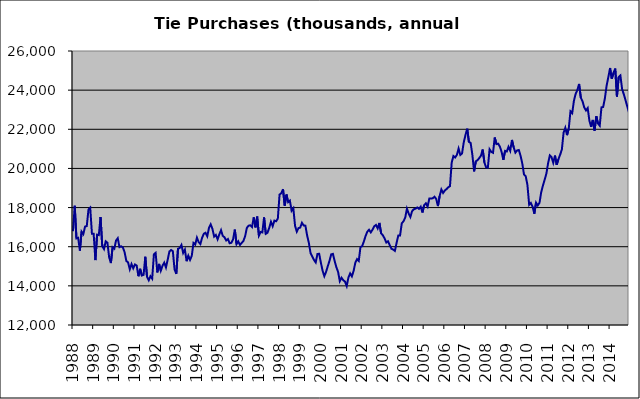
| Category | Series 0 |
|---|---|
| 1988.0 | 16794 |
| nan | 18096 |
| nan | 16425 |
| nan | 16454 |
| nan | 15802 |
| nan | 16769 |
| nan | 16644 |
| nan | 17028 |
| nan | 17057 |
| nan | 17905 |
| nan | 17995 |
| nan | 16665 |
| 1989.0 | 16665 |
| nan | 15316 |
| nan | 16619 |
| nan | 16593 |
| nan | 17519 |
| nan | 16026 |
| nan | 15879 |
| nan | 16277 |
| nan | 16203 |
| nan | 15461 |
| nan | 15163 |
| nan | 15972 |
| 1990.0 | 15899 |
| nan | 16314 |
| nan | 16434 |
| nan | 15977 |
| nan | 16020 |
| nan | 15960 |
| nan | 15711 |
| nan | 15271 |
| nan | 15199 |
| nan | 14844 |
| nan | 15113 |
| nan | 14898 |
| 1991.0 | 15092 |
| nan | 15037 |
| nan | 14492 |
| nan | 14871 |
| nan | 14530 |
| nan | 14562 |
| nan | 15485 |
| nan | 14460 |
| nan | 14286 |
| nan | 14494 |
| nan | 14368 |
| nan | 15613 |
| 1992.0 | 15687 |
| nan | 14688 |
| nan | 15120 |
| nan | 14773 |
| nan | 15028 |
| nan | 15185 |
| nan | 14940 |
| nan | 15334 |
| nan | 15756 |
| nan | 15832 |
| nan | 15770 |
| nan | 14841 |
| 1993.0 | 14611 |
| nan | 15894 |
| nan | 15935 |
| nan | 16089 |
| nan | 15681 |
| nan | 15852 |
| nan | 15260 |
| nan | 15539 |
| nan | 15326 |
| nan | 15535 |
| nan | 16195 |
| nan | 16113 |
| 1994.0 | 16461 |
| nan | 16234 |
| nan | 16139 |
| nan | 16458 |
| nan | 16663 |
| nan | 16714 |
| nan | 16533 |
| nan | 16965 |
| nan | 17141 |
| nan | 16912 |
| nan | 16518 |
| nan | 16600 |
| 1995.0 | 16377 |
| nan | 16627 |
| nan | 16845 |
| nan | 16555 |
| nan | 16483 |
| nan | 16320 |
| nan | 16392 |
| nan | 16177 |
| nan | 16200 |
| nan | 16378 |
| nan | 16874 |
| nan | 16131 |
| 1996.0 | 16274 |
| nan | 16091 |
| nan | 16194 |
| nan | 16295 |
| nan | 16540 |
| nan | 16965 |
| nan | 17074 |
| nan | 17096 |
| nan | 17004 |
| nan | 17502 |
| nan | 16988 |
| nan | 17539 |
| 1997.0 | 16566 |
| nan | 16751 |
| nan | 16730 |
| nan | 17496 |
| nan | 16659 |
| nan | 16714 |
| nan | 16966 |
| nan | 17275 |
| nan | 17050 |
| nan | 17334 |
| nan | 17299 |
| nan | 17439 |
| 1998.0 | 18664 |
| nan | 18734 |
| nan | 18936 |
| nan | 18098 |
| nan | 18667 |
| nan | 18275 |
| nan | 18355 |
| nan | 17838 |
| nan | 17966 |
| nan | 17066 |
| nan | 16772 |
| nan | 16950 |
| 1999.0 | 16977 |
| nan | 17223 |
| nan | 17085 |
| nan | 17076 |
| nan | 16579 |
| nan | 16203 |
| nan | 15678 |
| nan | 15500 |
| nan | 15324 |
| nan | 15196 |
| nan | 15627 |
| nan | 15640 |
| 2000.0 | 15186 |
| nan | 14772 |
| nan | 14494 |
| nan | 14711 |
| nan | 15001 |
| nan | 15277 |
| nan | 15608 |
| nan | 15633.6 |
| nan | 15268 |
| nan | 14952.4 |
| nan | 14714.4 |
| nan | 14235.1 |
| 2001.0 | 14412.1 |
| nan | 14288.1 |
| nan | 14220.1 |
| nan | 13991.1 |
| nan | 14425.1 |
| nan | 14636.1 |
| nan | 14486.1 |
| nan | 14755.5 |
| nan | 15180.1 |
| nan | 15366.7 |
| nan | 15270.7 |
| nan | 15981 |
| 2002.0 | 16029 |
| nan | 16278 |
| nan | 16554 |
| nan | 16772 |
| nan | 16864.779 |
| nan | 16732.143 |
| nan | 16869.773 |
| nan | 17044.272 |
| nan | 17110.816 |
| nan | 16935.357 |
| nan | 17214.632 |
| nan | 16685.945 |
| 2003.0 | 16584.762 |
| nan | 16423.965 |
| nan | 16213.153 |
| nan | 16279.62 |
| nan | 16079.803 |
| nan | 15893.929 |
| nan | 15856.449 |
| nan | 15786.375 |
| nan | 16206.63 |
| nan | 16576.807 |
| nan | 16577.258 |
| nan | 17193.927 |
| 2004.0 | 17300.698 |
| nan | 17486.896 |
| nan | 17943.35 |
| nan | 17698.616 |
| nan | 17520.808 |
| nan | 17820.038 |
| nan | 17913.671 |
| nan | 17943.361 |
| nan | 18006.259 |
| nan | 17933.267 |
| nan | 18045.705 |
| nan | 17749.231 |
| 2005.0 | 18120.293 |
| nan | 18217.964 |
| nan | 18050.513 |
| nan | 18460.353 |
| nan | 18462.346 |
| nan | 18474.613 |
| nan | 18553.183 |
| nan | 18441.251 |
| nan | 18076.596 |
| nan | 18589.667 |
| nan | 18925.778 |
| nan | 18744.891 |
| 2006.0 | 18872.122 |
| nan | 18943.051 |
| nan | 19035 |
| nan | 19096.504 |
| nan | 20301.829 |
| nan | 20633.39 |
| nan | 20558.545 |
| nan | 20688.386 |
| nan | 21013.776 |
| nan | 20688.165 |
| nan | 20761.253 |
| nan | 21332.775 |
| 2007.0 | 21704.659 |
| nan | 22029.336 |
| nan | 21356.246 |
| nan | 21304.71 |
| nan | 20700.172 |
| nan | 19851.439 |
| nan | 20360.531 |
| nan | 20422.597 |
| nan | 20527.979 |
| nan | 20652.564 |
| nan | 20966.065 |
| nan | 20301.696 |
| 2008.0 | 20054.77 |
| nan | 20037.097 |
| nan | 20977.505 |
| nan | 20844.486 |
| nan | 20798.047 |
| nan | 21580.707 |
| nan | 21241.811 |
| nan | 21264.942 |
| nan | 21111.38 |
| nan | 20841.661 |
| nan | 20439.02 |
| nan | 20896.232 |
| 2009.0 | 20863.704 |
| nan | 21104.27 |
| nan | 20898.69 |
| nan | 21455.363 |
| nan | 21078.741 |
| nan | 20806.603 |
| nan | 20920.173 |
| nan | 20941.076 |
| nan | 20648.757 |
| nan | 20256.647 |
| nan | 19692.437 |
| nan | 19604.055 |
| 2010.0 | 19148.944 |
| nan | 18142.822 |
| nan | 18231.973 |
| nan | 18042.422 |
| nan | 17685.593 |
| nan | 18253.454 |
| nan | 18107.794 |
| nan | 18239.4 |
| nan | 18788.04 |
| nan | 19124.813 |
| nan | 19421.05 |
| nan | 19735.982 |
| 2011.0 | 20267.368 |
| nan | 20662.733 |
| nan | 20573.808 |
| nan | 20287.484 |
| nan | 20655.189 |
| nan | 20185.167 |
| nan | 20475.06 |
| nan | 20700.175 |
| nan | 20969.137 |
| nan | 21828.66 |
| nan | 22076.202 |
| nan | 21699.581 |
| 2012.0 | 22034.885 |
| nan | 22917.926 |
| nan | 22823.2 |
| nan | 23452.563 |
| nan | 23806.877 |
| nan | 24003.444 |
| nan | 24316.991 |
| nan | 23613.628 |
| nan | 23434.252 |
| nan | 23117.15 |
| nan | 22963.606 |
| nan | 23081.551 |
| 2013.0 | 22435.959 |
| nan | 22122.495 |
| nan | 22476.498 |
| nan | 21929.786 |
| nan | 22666.032 |
| nan | 22295.532 |
| nan | 22180.968 |
| nan | 23119.766 |
| nan | 23138.87 |
| nan | 23588.791 |
| nan | 24231.321 |
| nan | 24664.451 |
| 2014.0 | 25131.231 |
| nan | 24577.817 |
| nan | 24884.209 |
| nan | 25100.818 |
| nan | 23672.19 |
| nan | 24666.211 |
| nan | 24748.858 |
| nan | 24050.723 |
| nan | 23784.308 |
| nan | 23481.026 |
| nan | 23166.266 |
| nan | 22861.557 |